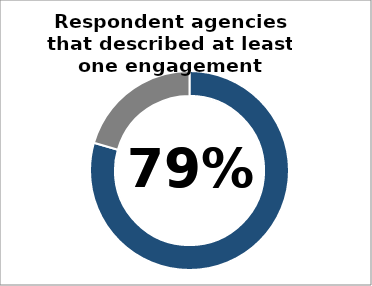
| Category | Series 0 |
|---|---|
| 0 | 0.795 |
| 1 | 0.205 |